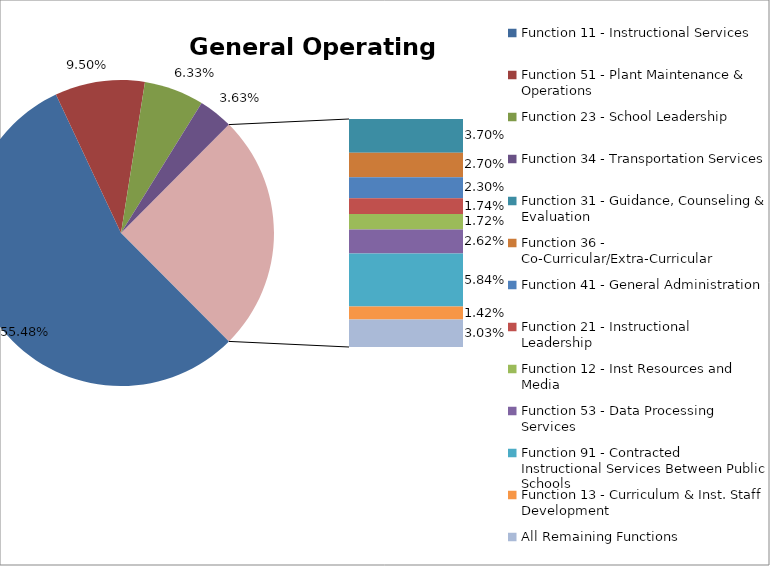
| Category | Series 0 |
|---|---|
| Function 11 - Instructional Services | 0.555 |
| Function 51 - Plant Maintenance & Operations | 0.095 |
| Function 23 - School Leadership | 0.063 |
| Function 34 - Transportation Services | 0.036 |
| Function 31 - Guidance, Counseling & Evaluation | 0.037 |
| Function 36 - Co-Curricular/Extra-Curricular | 0.027 |
| Function 41 - General Administration | 0.023 |
| Function 21 - Instructional Leadership | 0.017 |
| Function 12 - Inst Resources and Media | 0.017 |
| Function 53 - Data Processing Services | 0.026 |
| Function 91 - Contracted Instructional Services Between Public Schools | 0.058 |
| Function 13 - Curriculum & Inst. Staff Development | 0.014 |
| All Remaining Functions | 0.03 |